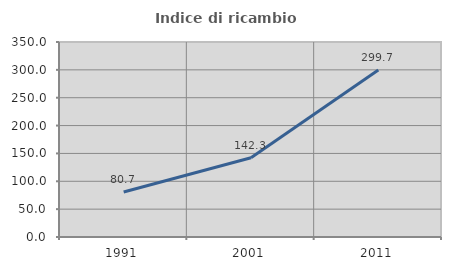
| Category | Indice di ricambio occupazionale  |
|---|---|
| 1991.0 | 80.693 |
| 2001.0 | 142.259 |
| 2011.0 | 299.718 |